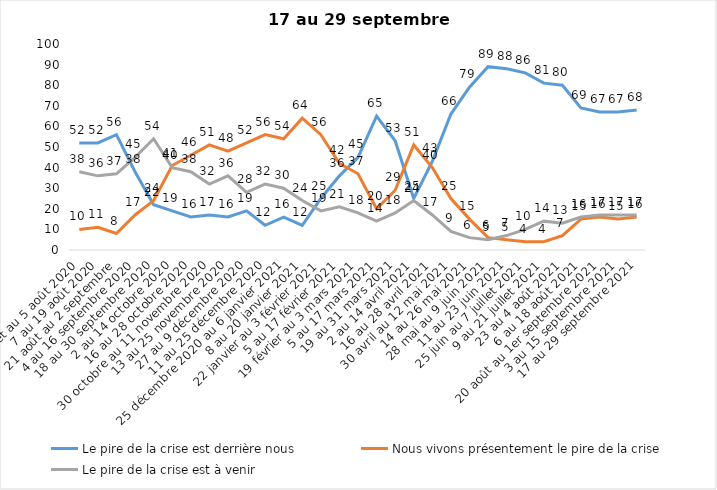
| Category | Le pire de la crise est derrière nous | Nous vivons présentement le pire de la crise | Le pire de la crise est à venir |
|---|---|---|---|
| 24 juillet au 5 août 2020 | 52 | 10 | 38 |
| 7 au 19 août 2020 | 52 | 11 | 36 |
| 21 août au 2 septembre | 56 | 8 | 37 |
| 4 au 16 septembre 2020 | 38 | 17 | 45 |
| 18 au 30 septembre 2020 | 22 | 24 | 54 |
| 2 au 14 octobre 2020 | 19 | 41 | 40 |
| 16 au 28 octobre 2020 | 16 | 46 | 38 |
| 30 octobre au 11 novembre 2020 | 17 | 51 | 32 |
| 13 au 25 novembre 2020 | 16 | 48 | 36 |
| 27 au 9 décembre 2020 | 19 | 52 | 28 |
| 11 au 25 décembre 2020 | 12 | 56 | 32 |
| 25 décembre 2020 au 6 janvier 2021 | 16 | 54 | 30 |
| 8 au 20 janvier 2021 | 12 | 64 | 24 |
| 22 janvier au 3 février 2021 | 25 | 56 | 19 |
| 5 au 17 février 2021 | 36 | 42 | 21 |
| 19 février au 3 mars 2021 | 45 | 37 | 18 |
| 5 au 17 mars 2021 | 65 | 20 | 14 |
| 19 au 31 mars 2021 | 53 | 29 | 18 |
| 2 au 14 avril 2021 | 25 | 51 | 24 |
| 16 au 28 avril 2021 | 43 | 40 | 17 |
| 30 avril au 12 mai 2021 | 66 | 25 | 9 |
| 14 au 26 mai 2021 | 79 | 15 | 6 |
| 28 mai au 9 juin 2021 | 89 | 6 | 5 |
| 11 au 23 juin 2021 | 88 | 5 | 7 |
| 25 juin au 7 juillet 2021 | 86 | 4 | 10 |
| 9 au 21 juillet 2021 | 81 | 4 | 14 |
| 23 au 4 août 2021 | 80 | 7 | 13 |
| 6 au 18 août 2021 | 69 | 15 | 16 |
| 20 août au 1er septembre 2021 | 67 | 16 | 17 |
| 3 au 15 septembre 2021 | 67 | 15 | 17 |
| 17 au 29 septembre 2021 | 68 | 16 | 17 |